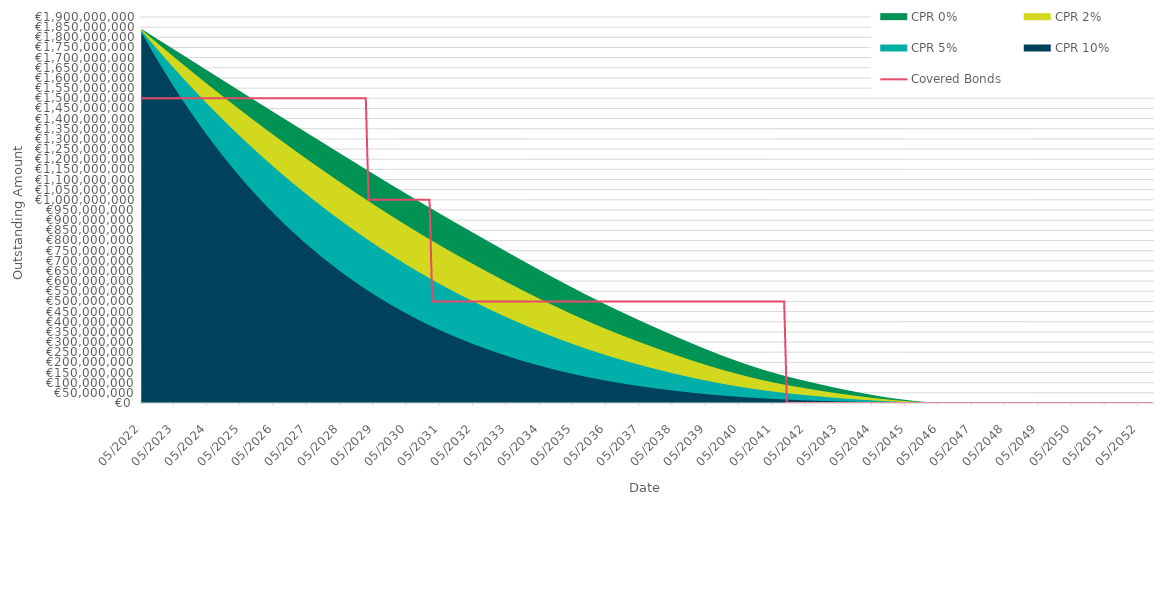
| Category | Covered Bonds |
|---|---|
| 2022-05-31 | 1500000000 |
| 2022-06-30 | 1500000000 |
| 2022-07-31 | 1500000000 |
| 2022-08-31 | 1500000000 |
| 2022-09-30 | 1500000000 |
| 2022-10-31 | 1500000000 |
| 2022-11-30 | 1500000000 |
| 2022-12-31 | 1500000000 |
| 2023-01-31 | 1500000000 |
| 2023-02-28 | 1500000000 |
| 2023-03-31 | 1500000000 |
| 2023-04-30 | 1500000000 |
| 2023-05-31 | 1500000000 |
| 2023-06-30 | 1500000000 |
| 2023-07-31 | 1500000000 |
| 2023-08-31 | 1500000000 |
| 2023-09-30 | 1500000000 |
| 2023-10-31 | 1500000000 |
| 2023-11-30 | 1500000000 |
| 2023-12-31 | 1500000000 |
| 2024-01-31 | 1500000000 |
| 2024-02-29 | 1500000000 |
| 2024-03-31 | 1500000000 |
| 2024-04-30 | 1500000000 |
| 2024-05-31 | 1500000000 |
| 2024-06-30 | 1500000000 |
| 2024-07-31 | 1500000000 |
| 2024-08-31 | 1500000000 |
| 2024-09-30 | 1500000000 |
| 2024-10-31 | 1500000000 |
| 2024-11-30 | 1500000000 |
| 2024-12-31 | 1500000000 |
| 2025-01-31 | 1500000000 |
| 2025-02-28 | 1500000000 |
| 2025-03-31 | 1500000000 |
| 2025-04-30 | 1500000000 |
| 2025-05-31 | 1500000000 |
| 2025-06-30 | 1500000000 |
| 2025-07-31 | 1500000000 |
| 2025-08-31 | 1500000000 |
| 2025-09-30 | 1500000000 |
| 2025-10-31 | 1500000000 |
| 2025-11-30 | 1500000000 |
| 2025-12-31 | 1500000000 |
| 2026-01-31 | 1500000000 |
| 2026-02-28 | 1500000000 |
| 2026-03-31 | 1500000000 |
| 2026-04-30 | 1500000000 |
| 2026-05-31 | 1500000000 |
| 2026-06-30 | 1500000000 |
| 2026-07-31 | 1500000000 |
| 2026-08-31 | 1500000000 |
| 2026-09-30 | 1500000000 |
| 2026-10-31 | 1500000000 |
| 2026-11-30 | 1500000000 |
| 2026-12-31 | 1500000000 |
| 2027-01-31 | 1500000000 |
| 2027-02-28 | 1500000000 |
| 2027-03-31 | 1500000000 |
| 2027-04-30 | 1500000000 |
| 2027-05-31 | 1500000000 |
| 2027-06-30 | 1500000000 |
| 2027-07-31 | 1500000000 |
| 2027-08-31 | 1500000000 |
| 2027-09-30 | 1500000000 |
| 2027-10-31 | 1500000000 |
| 2027-11-30 | 1500000000 |
| 2027-12-31 | 1500000000 |
| 2028-01-31 | 1500000000 |
| 2028-02-29 | 1500000000 |
| 2028-03-31 | 1500000000 |
| 2028-04-30 | 1500000000 |
| 2028-05-31 | 1500000000 |
| 2028-06-30 | 1500000000 |
| 2028-07-31 | 1500000000 |
| 2028-08-31 | 1500000000 |
| 2028-09-30 | 1500000000 |
| 2028-10-31 | 1500000000 |
| 2028-11-30 | 1500000000 |
| 2028-12-31 | 1500000000 |
| 2029-01-31 | 1500000000 |
| 2029-02-28 | 1500000000 |
| 2029-03-31 | 1000000000 |
| 2029-04-30 | 1000000000 |
| 2029-05-31 | 1000000000 |
| 2029-06-30 | 1000000000 |
| 2029-07-31 | 1000000000 |
| 2029-08-31 | 1000000000 |
| 2029-09-30 | 1000000000 |
| 2029-10-31 | 1000000000 |
| 2029-11-30 | 1000000000 |
| 2029-12-31 | 1000000000 |
| 2030-01-31 | 1000000000 |
| 2030-02-28 | 1000000000 |
| 2030-03-31 | 1000000000 |
| 2030-04-30 | 1000000000 |
| 2030-05-31 | 1000000000 |
| 2030-06-30 | 1000000000 |
| 2030-07-31 | 1000000000 |
| 2030-08-31 | 1000000000 |
| 2030-09-30 | 1000000000 |
| 2030-10-31 | 1000000000 |
| 2030-11-30 | 1000000000 |
| 2030-12-31 | 1000000000 |
| 2031-01-31 | 1000000000 |
| 2031-02-28 | 500000000 |
| 2031-03-31 | 500000000 |
| 2031-04-30 | 500000000 |
| 2031-05-31 | 500000000 |
| 2031-06-30 | 500000000 |
| 2031-07-31 | 500000000 |
| 2031-08-31 | 500000000 |
| 2031-09-30 | 500000000 |
| 2031-10-31 | 500000000 |
| 2031-11-30 | 500000000 |
| 2031-12-31 | 500000000 |
| 2032-01-31 | 500000000 |
| 2032-02-29 | 500000000 |
| 2032-03-31 | 500000000 |
| 2032-04-30 | 500000000 |
| 2032-05-31 | 500000000 |
| 2032-06-30 | 500000000 |
| 2032-07-31 | 500000000 |
| 2032-08-31 | 500000000 |
| 2032-09-30 | 500000000 |
| 2032-10-31 | 500000000 |
| 2032-11-30 | 500000000 |
| 2032-12-31 | 500000000 |
| 2033-01-31 | 500000000 |
| 2033-02-28 | 500000000 |
| 2033-03-31 | 500000000 |
| 2033-04-30 | 500000000 |
| 2033-05-31 | 500000000 |
| 2033-06-30 | 500000000 |
| 2033-07-31 | 500000000 |
| 2033-08-31 | 500000000 |
| 2033-09-30 | 500000000 |
| 2033-10-31 | 500000000 |
| 2033-11-30 | 500000000 |
| 2033-12-31 | 500000000 |
| 2034-01-31 | 500000000 |
| 2034-02-28 | 500000000 |
| 2034-03-31 | 500000000 |
| 2034-04-30 | 500000000 |
| 2034-05-31 | 500000000 |
| 2034-06-30 | 500000000 |
| 2034-07-31 | 500000000 |
| 2034-08-31 | 500000000 |
| 2034-09-30 | 500000000 |
| 2034-10-31 | 500000000 |
| 2034-11-30 | 500000000 |
| 2034-12-31 | 500000000 |
| 2035-01-31 | 500000000 |
| 2035-02-28 | 500000000 |
| 2035-03-31 | 500000000 |
| 2035-04-30 | 500000000 |
| 2035-05-31 | 500000000 |
| 2035-06-30 | 500000000 |
| 2035-07-31 | 500000000 |
| 2035-08-31 | 500000000 |
| 2035-09-30 | 500000000 |
| 2035-10-31 | 500000000 |
| 2035-11-30 | 500000000 |
| 2035-12-31 | 500000000 |
| 2036-01-31 | 500000000 |
| 2036-02-29 | 500000000 |
| 2036-03-31 | 500000000 |
| 2036-04-30 | 500000000 |
| 2036-05-31 | 500000000 |
| 2036-06-30 | 500000000 |
| 2036-07-31 | 500000000 |
| 2036-08-31 | 500000000 |
| 2036-09-30 | 500000000 |
| 2036-10-31 | 500000000 |
| 2036-11-30 | 500000000 |
| 2036-12-31 | 500000000 |
| 2037-01-31 | 500000000 |
| 2037-02-28 | 500000000 |
| 2037-03-31 | 500000000 |
| 2037-04-30 | 500000000 |
| 2037-05-31 | 500000000 |
| 2037-06-30 | 500000000 |
| 2037-07-31 | 500000000 |
| 2037-08-31 | 500000000 |
| 2037-09-30 | 500000000 |
| 2037-10-31 | 500000000 |
| 2037-11-30 | 500000000 |
| 2037-12-31 | 500000000 |
| 2038-01-31 | 500000000 |
| 2038-02-28 | 500000000 |
| 2038-03-31 | 500000000 |
| 2038-04-30 | 500000000 |
| 2038-05-31 | 500000000 |
| 2038-06-30 | 500000000 |
| 2038-07-31 | 500000000 |
| 2038-08-31 | 500000000 |
| 2038-09-30 | 500000000 |
| 2038-10-31 | 500000000 |
| 2038-11-30 | 500000000 |
| 2038-12-31 | 500000000 |
| 2039-01-31 | 500000000 |
| 2039-02-28 | 500000000 |
| 2039-03-31 | 500000000 |
| 2039-04-30 | 500000000 |
| 2039-05-31 | 500000000 |
| 2039-06-30 | 500000000 |
| 2039-07-31 | 500000000 |
| 2039-08-31 | 500000000 |
| 2039-09-30 | 500000000 |
| 2039-10-31 | 500000000 |
| 2039-11-30 | 500000000 |
| 2039-12-31 | 500000000 |
| 2040-01-31 | 500000000 |
| 2040-02-29 | 500000000 |
| 2040-03-31 | 500000000 |
| 2040-04-30 | 500000000 |
| 2040-05-31 | 500000000 |
| 2040-06-30 | 500000000 |
| 2040-07-31 | 500000000 |
| 2040-08-31 | 500000000 |
| 2040-09-30 | 500000000 |
| 2040-10-31 | 500000000 |
| 2040-11-30 | 500000000 |
| 2040-12-31 | 500000000 |
| 2041-01-31 | 500000000 |
| 2041-02-28 | 500000000 |
| 2041-03-31 | 500000000 |
| 2041-04-30 | 500000000 |
| 2041-05-31 | 500000000 |
| 2041-06-30 | 500000000 |
| 2041-07-31 | 500000000 |
| 2041-08-31 | 500000000 |
| 2041-09-30 | 500000000 |
| 2041-10-31 | 0 |
| 2041-11-30 | 0 |
| 2041-12-31 | 0 |
| 2042-01-31 | 0 |
| 2042-02-28 | 0 |
| 2042-03-31 | 0 |
| 2042-04-30 | 0 |
| 2042-05-31 | 0 |
| 2042-06-30 | 0 |
| 2042-07-31 | 0 |
| 2042-08-31 | 0 |
| 2042-09-30 | 0 |
| 2042-10-31 | 0 |
| 2042-11-30 | 0 |
| 2042-12-31 | 0 |
| 2043-01-31 | 0 |
| 2043-02-28 | 0 |
| 2043-03-31 | 0 |
| 2043-04-30 | 0 |
| 2043-05-31 | 0 |
| 2043-06-30 | 0 |
| 2043-07-31 | 0 |
| 2043-08-31 | 0 |
| 2043-09-30 | 0 |
| 2043-10-31 | 0 |
| 2043-11-30 | 0 |
| 2043-12-31 | 0 |
| 2044-01-31 | 0 |
| 2044-02-29 | 0 |
| 2044-03-31 | 0 |
| 2044-04-30 | 0 |
| 2044-05-31 | 0 |
| 2044-06-30 | 0 |
| 2044-07-31 | 0 |
| 2044-08-31 | 0 |
| 2044-09-30 | 0 |
| 2044-10-31 | 0 |
| 2044-11-30 | 0 |
| 2044-12-31 | 0 |
| 2045-01-31 | 0 |
| 2045-02-28 | 0 |
| 2045-03-31 | 0 |
| 2045-04-30 | 0 |
| 2045-05-31 | 0 |
| 2045-06-30 | 0 |
| 2045-07-31 | 0 |
| 2045-08-31 | 0 |
| 2045-09-30 | 0 |
| 2045-10-31 | 0 |
| 2045-11-30 | 0 |
| 2045-12-31 | 0 |
| 2046-01-31 | 0 |
| 2046-02-28 | 0 |
| 2046-03-31 | 0 |
| 2046-04-30 | 0 |
| 2046-05-31 | 0 |
| 2046-06-30 | 0 |
| 2046-07-31 | 0 |
| 2046-08-31 | 0 |
| 2046-09-30 | 0 |
| 2046-10-31 | 0 |
| 2046-11-30 | 0 |
| 2046-12-31 | 0 |
| 2047-01-31 | 0 |
| 2047-02-28 | 0 |
| 2047-03-31 | 0 |
| 2047-04-30 | 0 |
| 2047-05-31 | 0 |
| 2047-06-30 | 0 |
| 2047-07-31 | 0 |
| 2047-08-31 | 0 |
| 2047-09-30 | 0 |
| 2047-10-31 | 0 |
| 2047-11-30 | 0 |
| 2047-12-31 | 0 |
| 2048-01-31 | 0 |
| 2048-02-29 | 0 |
| 2048-03-31 | 0 |
| 2048-04-30 | 0 |
| 2048-05-31 | 0 |
| 2048-06-30 | 0 |
| 2048-07-31 | 0 |
| 2048-08-31 | 0 |
| 2048-09-30 | 0 |
| 2048-10-31 | 0 |
| 2048-11-30 | 0 |
| 2048-12-31 | 0 |
| 2049-01-31 | 0 |
| 2049-02-28 | 0 |
| 2049-03-31 | 0 |
| 2049-04-30 | 0 |
| 2049-05-31 | 0 |
| 2049-06-30 | 0 |
| 2049-07-31 | 0 |
| 2049-08-31 | 0 |
| 2049-09-30 | 0 |
| 2049-10-31 | 0 |
| 2049-11-30 | 0 |
| 2049-12-31 | 0 |
| 2050-01-31 | 0 |
| 2050-02-28 | 0 |
| 2050-03-31 | 0 |
| 2050-04-30 | 0 |
| 2050-05-31 | 0 |
| 2050-06-30 | 0 |
| 2050-07-31 | 0 |
| 2050-08-31 | 0 |
| 2050-09-30 | 0 |
| 2050-10-31 | 0 |
| 2050-11-30 | 0 |
| 2050-12-31 | 0 |
| 2051-01-31 | 0 |
| 2051-02-28 | 0 |
| 2051-03-31 | 0 |
| 2051-04-30 | 0 |
| 2051-05-31 | 0 |
| 2051-06-30 | 0 |
| 2051-07-31 | 0 |
| 2051-08-31 | 0 |
| 2051-09-30 | 0 |
| 2051-10-31 | 0 |
| 2051-11-30 | 0 |
| 2051-12-31 | 0 |
| 2052-01-31 | 0 |
| 2052-02-29 | 0 |
| 2052-03-31 | 0 |
| 2052-04-30 | 0 |
| 2052-05-31 | 0 |
| 2052-06-30 | 0 |
| 2052-07-31 | 0 |
| 2052-08-31 | 0 |
| 2052-09-30 | 0 |
| 2052-10-31 | 0 |